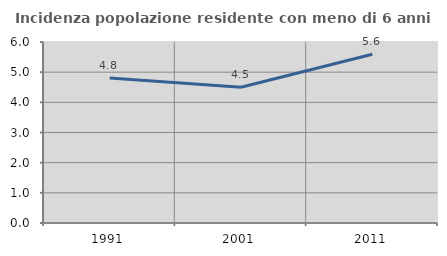
| Category | Incidenza popolazione residente con meno di 6 anni |
|---|---|
| 1991.0 | 4.808 |
| 2001.0 | 4.498 |
| 2011.0 | 5.592 |